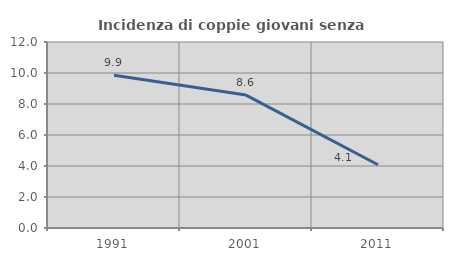
| Category | Incidenza di coppie giovani senza figli |
|---|---|
| 1991.0 | 9.856 |
| 2001.0 | 8.577 |
| 2011.0 | 4.082 |